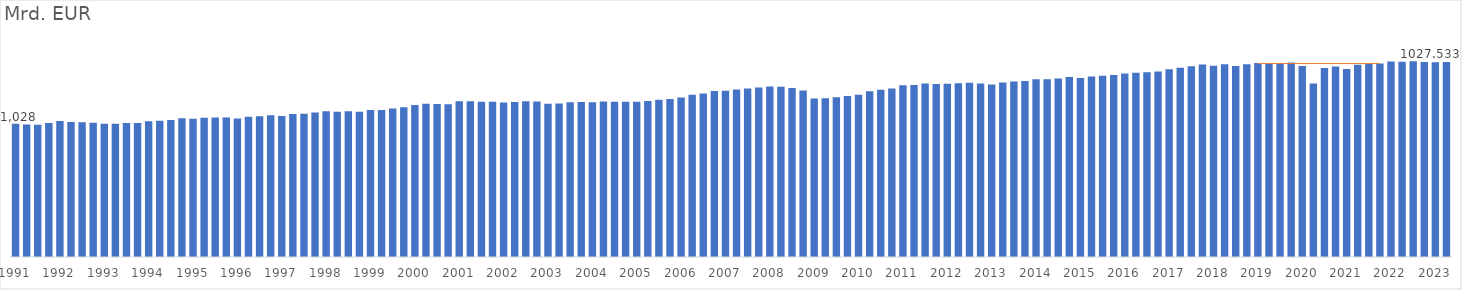
| Category | BIP |
|---|---|
| 1991.0 | 73.69 |
| nan | 73.3 |
| nan | 73.14 |
| nan | 74.08 |
| 1992.0 | 75.21 |
| nan | 74.64 |
| nan | 74.51 |
| nan | 74.27 |
| 1993.0 | 73.72 |
| nan | 73.7 |
| nan | 74.15 |
| nan | 74.09 |
| 1994.0 | 75.11 |
| nan | 75.29 |
| nan | 75.82 |
| nan | 76.72 |
| 1995.0 | 76.46 |
| nan | 77.02 |
| nan | 77.15 |
| nan | 77.19 |
| 1996.0 | 76.56 |
| nan | 77.59 |
| nan | 77.85 |
| nan | 78.44 |
| 1997.0 | 78.03 |
| nan | 79.04 |
| nan | 79.28 |
| nan | 79.88 |
| 1998.0 | 80.63 |
| nan | 80.28 |
| nan | 80.66 |
| nan | 80.33 |
| 1999.0 | 81.26 |
| nan | 81.26 |
| nan | 82.17 |
| nan | 82.84 |
| 2000.0 | 84.02 |
| nan | 84.7 |
| nan | 84.66 |
| nan | 84.41 |
| 2001.0 | 86.12 |
| nan | 86.08 |
| nan | 85.9 |
| nan | 85.83 |
| 2002.0 | 85.39 |
| nan | 85.76 |
| nan | 86.16 |
| nan | 86.05 |
| 2003.0 | 84.78 |
| nan | 84.87 |
| nan | 85.52 |
| nan | 85.76 |
| 2004.0 | 85.61 |
| nan | 86.05 |
| nan | 85.87 |
| nan | 85.79 |
| 2005.0 | 85.79 |
| nan | 86.25 |
| nan | 86.98 |
| nan | 87.39 |
| 2006.0 | 88.23 |
| nan | 89.75 |
| nan | 90.45 |
| nan | 91.82 |
| 2007.0 | 91.88 |
| nan | 92.65 |
| nan | 93.13 |
| nan | 93.73 |
| 2008.0 | 94.33 |
| nan | 94.1 |
| nan | 93.5 |
| nan | 92.01 |
| 2009.0 | 87.7 |
| nan | 87.84 |
| nan | 88.33 |
| nan | 88.98 |
| 2010.0 | 89.7 |
| nan | 91.72 |
| nan | 92.47 |
| nan | 93.22 |
| 2011.0 | 95.03 |
| nan | 95.12 |
| nan | 95.96 |
| nan | 95.65 |
| 2012.0 | 95.85 |
| nan | 96.05 |
| nan | 96.32 |
| nan | 95.89 |
| 2013.0 | 95.45 |
| nan | 96.47 |
| nan | 97.01 |
| nan | 97.29 |
| 2014.0 | 98.24 |
| nan | 98.24 |
| nan | 98.74 |
| nan | 99.54 |
| 2015.0 | 99.03 |
| nan | 99.76 |
| nan | 100.21 |
| nan | 100.65 |
| 2016.0 | 101.49 |
| nan | 101.94 |
| nan | 102.2 |
| nan | 102.57 |
| 2017.0 | 103.81 |
| nan | 104.69 |
| nan | 105.46 |
| nan | 106.42 |
| 2018.0 | 105.78 |
| nan | 106.64 |
| nan | 105.65 |
| nan | 106.56 |
| 2019.0 | 107.29 |
| nan | 107.25 |
| nan | 107.23 |
| nan | 107.55 |
| 2020.0 | 105.65 |
| nan | 95.91 |
| nan | 104.46 |
| nan | 105.28 |
| 2021.0 | 103.94 |
| nan | 106.26 |
| nan | 106.97 |
| nan | 106.98 |
| 2022.0 | 108.05 |
| nan | 107.91 |
| nan | 108.3 |
| nan | 107.86 |
| 2023.0 | 107.76 |
| nan | 107.78 |